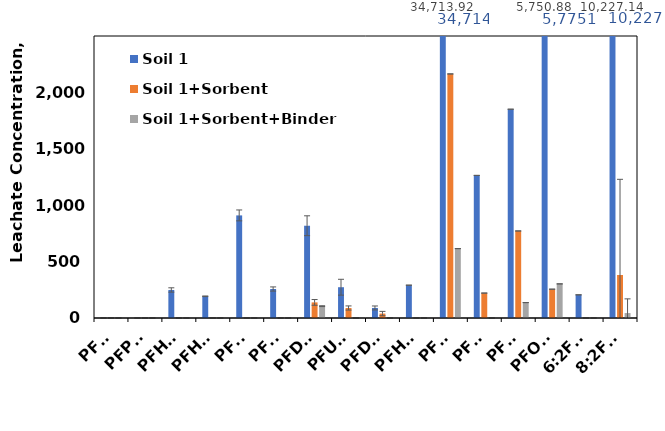
| Category | Soil 1 | Soil 1+Sorbent | Soil 1+Sorbent+Binder |
|---|---|---|---|
| PFBA | 0 | 0 | 0 |
| PFPeA | 0 | 0 | 0 |
| PFHxA | 248.474 | 0 | 0 |
| PFHpA | 192.479 | 0 | 0 |
| PFOA | 909.19 | 0 | 0 |
| PFNA | 256.86 | 0 | 0 |
| PFDA | 817.604 | 138.382 | 104.938 |
| PFUnA | 272.856 | 88.662 | 0 |
| PFDoA | 88.952 | 39.379 | 0 |
| PFHxS | 290.88 | 0 | 0 |
| PFOS | 34713.924 | 2163.082 | 615.017 |
| PFNS | 1263.739 | 220.885 | 0 |
| PFDS | 1850.21 | 771.394 | 136.629 |
| PFOSA | 5750.879 | 255.395 | 302.408 |
| 6:2FTS | 205.446 | 0 | 0 |
| 8:2FTS | 10227.144 | 381.135 | 43.782 |